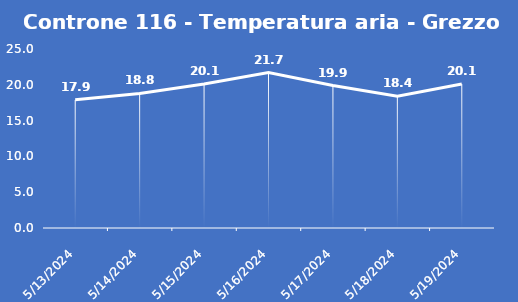
| Category | Controne 116 - Temperatura aria - Grezzo (°C) |
|---|---|
| 5/13/24 | 17.9 |
| 5/14/24 | 18.8 |
| 5/15/24 | 20.1 |
| 5/16/24 | 21.7 |
| 5/17/24 | 19.9 |
| 5/18/24 | 18.4 |
| 5/19/24 | 20.1 |